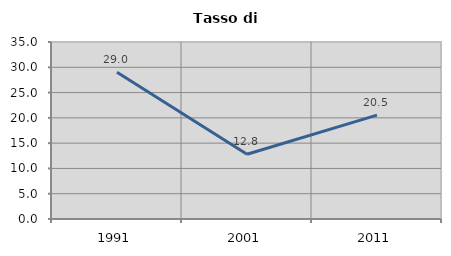
| Category | Tasso di disoccupazione   |
|---|---|
| 1991.0 | 29.001 |
| 2001.0 | 12.809 |
| 2011.0 | 20.529 |